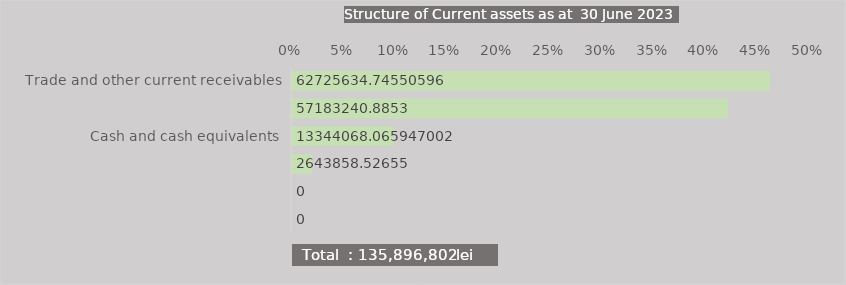
| Category | Series 0 |
|---|---|
| Trade and other current receivables | 0.462 |
| Current inventories | 0.421 |
| Cash and cash equivalents | 0.098 |
| Other current non-financial assets | 0.019 |
|  | 0 |
| Non-current assets or disposal groups classified as held for sale or as held for distribution to owners | 0 |